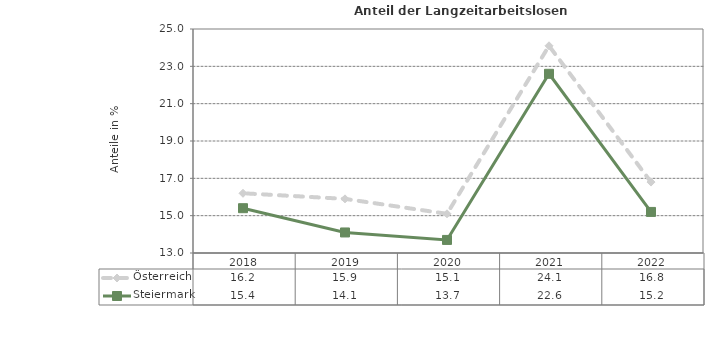
| Category | Österreich | Steiermark |
|---|---|---|
| 2022.0 | 16.8 | 15.2 |
| 2021.0 | 24.1 | 22.6 |
| 2020.0 | 15.1 | 13.7 |
| 2019.0 | 15.9 | 14.1 |
| 2018.0 | 16.2 | 15.4 |